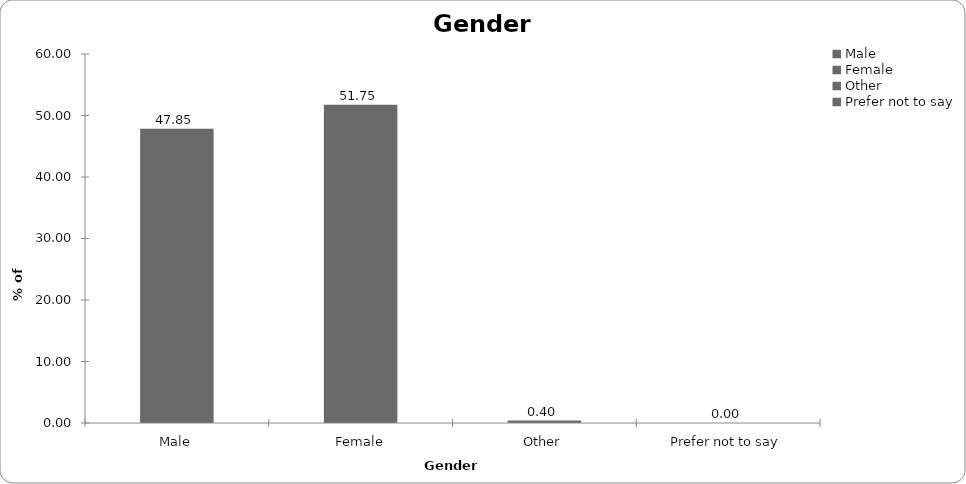
| Category | Series 0 |
|---|---|
| Male | 47.848 |
| Female | 51.752 |
| Other | 0.4 |
| Prefer not to say | 0 |